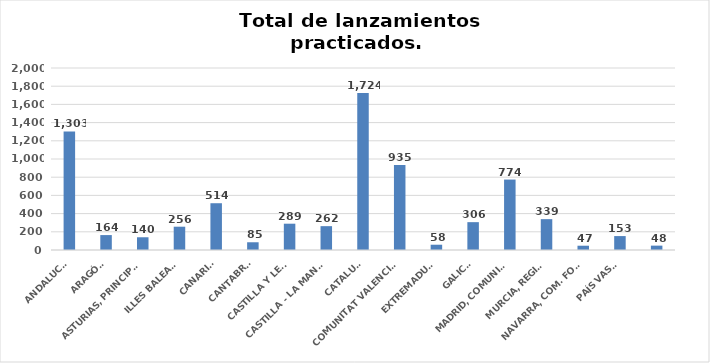
| Category | Series 0 |
|---|---|
| ANDALUCÍA | 1303 |
| ARAGÓN | 164 |
| ASTURIAS, PRINCIPADO | 140 |
| ILLES BALEARS | 256 |
| CANARIAS | 514 |
| CANTABRIA | 85 |
| CASTILLA Y LEÓN | 289 |
| CASTILLA - LA MANCHA | 262 |
| CATALUÑA | 1724 |
| COMUNITAT VALENCIANA | 935 |
| EXTREMADURA | 58 |
| GALICIA | 306 |
| MADRID, COMUNIDAD | 774 |
| MURCIA, REGIÓN | 339 |
| NAVARRA, COM. FORAL | 47 |
| PAÍS VASCO | 153 |